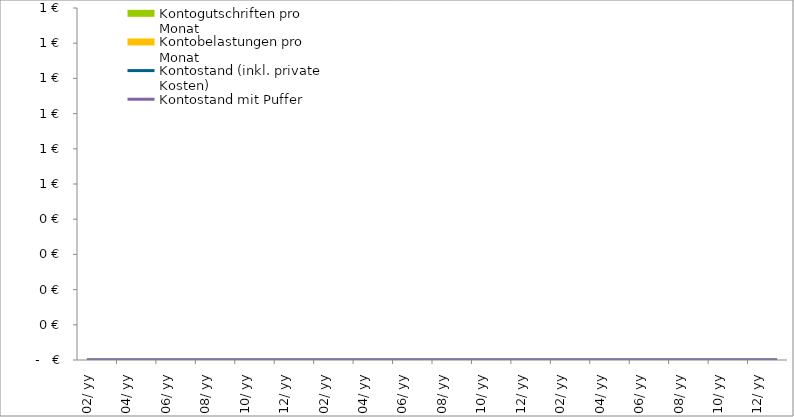
| Category | Kontogutschriften pro Monat | Kontobelastungen pro Monat |
|---|---|---|
| 2019-02-01 | 0 | 0 |
| 2019-03-01 | 0 | 0 |
| 2019-04-01 | 0 | 0 |
| 2019-05-01 | 0 | 0 |
| 2019-06-01 | 0 | 0 |
| 2019-07-01 | 0 | 0 |
| 2019-08-01 | 0 | 0 |
| 2019-09-01 | 0 | 0 |
| 2019-10-01 | 0 | 0 |
| 2019-11-01 | 0 | 0 |
| 2019-12-01 | 0 | 0 |
| 2020-01-01 | 0 | 0 |
| 2020-02-01 | 0 | 0 |
| 2020-03-01 | 0 | 0 |
| 2020-04-01 | 0 | 0 |
| 2020-05-01 | 0 | 0 |
| 2020-06-01 | 0 | 0 |
| 2020-07-01 | 0 | 0 |
| 2020-08-01 | 0 | 0 |
| 2020-09-01 | 0 | 0 |
| 2020-10-01 | 0 | 0 |
| 2020-11-01 | 0 | 0 |
| 2020-12-01 | 0 | 0 |
| 2021-01-01 | 0 | 0 |
| 2021-02-01 | 0 | 0 |
| 2021-03-01 | 0 | 0 |
| 2021-04-01 | 0 | 0 |
| 2021-05-01 | 0 | 0 |
| 2021-06-01 | 0 | 0 |
| 2021-07-01 | 0 | 0 |
| 2021-08-01 | 0 | 0 |
| 2021-09-01 | 0 | 0 |
| 2021-10-01 | 0 | 0 |
| 2021-11-01 | 0 | 0 |
| 2021-12-01 | 0 | 0 |
| 2022-01-01 | 0 | 0 |